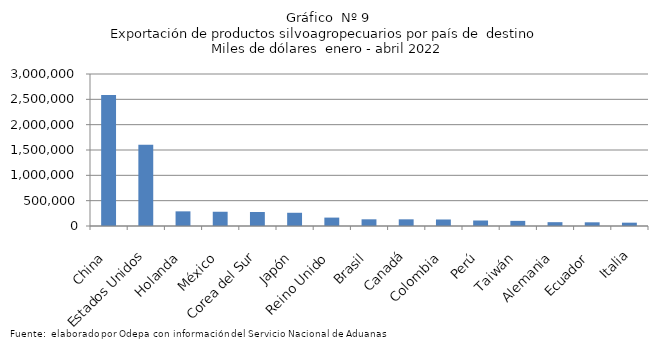
| Category | Series 0 |
|---|---|
| China | 2586738.674 |
| Estados Unidos | 1602123.768 |
| Holanda | 289125.536 |
| México | 281227.863 |
| Corea del Sur | 275863.92 |
| Japón | 261121.44 |
| Reino Unido | 165918.697 |
| Brasil | 132075.147 |
| Canadá | 131680.188 |
| Colombia | 128530.269 |
| Perú | 108583.013 |
| Taiwán | 101362.488 |
| Alemania | 75355.384 |
| Ecuador | 72799.521 |
| Italia | 65788.066 |